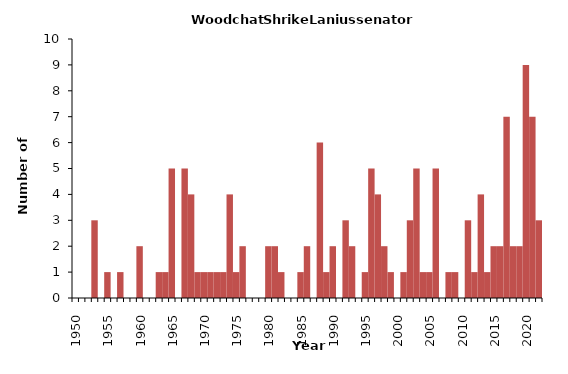
| Category | Series 1 |
|---|---|
| 1950.0 | 0 |
| 1951.0 | 0 |
| 1952.0 | 0 |
| 1953.0 | 3 |
| 1954.0 | 0 |
| 1955.0 | 1 |
| 1956.0 | 0 |
| 1957.0 | 1 |
| 1958.0 | 0 |
| 1959.0 | 0 |
| 1960.0 | 2 |
| 1961.0 | 0 |
| 1962.0 | 0 |
| 1963.0 | 1 |
| 1964.0 | 1 |
| 1965.0 | 5 |
| 1966.0 | 0 |
| 1967.0 | 5 |
| 1968.0 | 4 |
| 1969.0 | 1 |
| 1970.0 | 1 |
| 1971.0 | 1 |
| 1972.0 | 1 |
| 1973.0 | 1 |
| 1974.0 | 4 |
| 1975.0 | 1 |
| 1976.0 | 2 |
| 1977.0 | 0 |
| 1978.0 | 0 |
| 1979.0 | 0 |
| 1980.0 | 2 |
| 1981.0 | 2 |
| 1982.0 | 1 |
| 1983.0 | 0 |
| 1984.0 | 0 |
| 1985.0 | 1 |
| 1986.0 | 2 |
| 1987.0 | 0 |
| 1988.0 | 6 |
| 1989.0 | 1 |
| 1990.0 | 2 |
| 1991.0 | 0 |
| 1992.0 | 3 |
| 1993.0 | 2 |
| 1994.0 | 0 |
| 1995.0 | 1 |
| 1996.0 | 5 |
| 1997.0 | 4 |
| 1998.0 | 2 |
| 1999.0 | 1 |
| 2000.0 | 0 |
| 2001.0 | 1 |
| 2002.0 | 3 |
| 2003.0 | 5 |
| 2004.0 | 1 |
| 2005.0 | 1 |
| 2006.0 | 5 |
| 2007.0 | 0 |
| 2008.0 | 1 |
| 2009.0 | 1 |
| 2010.0 | 0 |
| 2011.0 | 3 |
| 2012.0 | 1 |
| 2013.0 | 4 |
| 2014.0 | 1 |
| 2015.0 | 2 |
| 2016.0 | 2 |
| 2017.0 | 7 |
| 2018.0 | 2 |
| 2019.0 | 2 |
| 2020.0 | 9 |
| 2021.0 | 7 |
| 2022.0 | 3 |